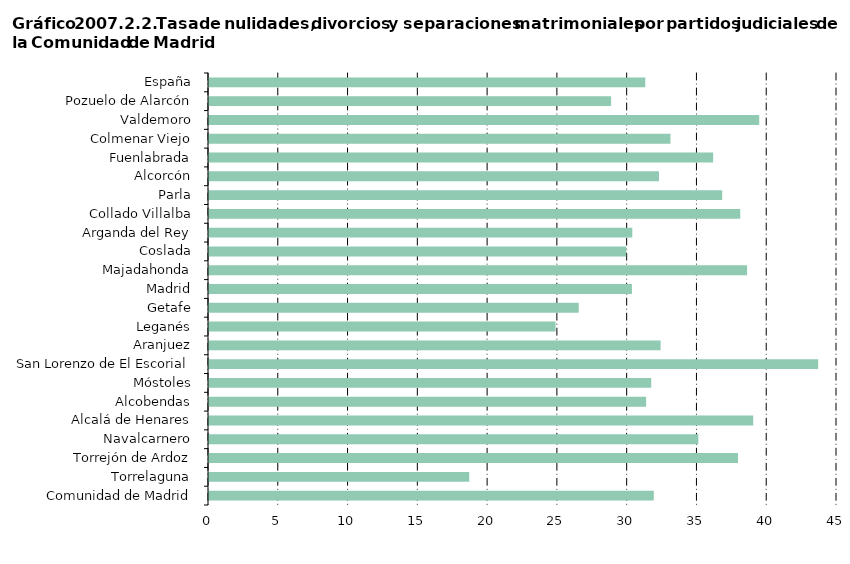
| Category | Series 0 |
|---|---|
| Comunidad de Madrid | 31.871 |
|     Torrelaguna | 18.646 |
|     Torrejón de Ardoz | 37.908 |
|     Navalcarnero | 35.066 |
|     Alcalá de Henares | 39 |
|     Alcobendas | 31.323 |
|     Móstoles | 31.689 |
|     San Lorenzo de El Escorial | 43.652 |
|     Aranjuez | 32.361 |
|     Leganés | 24.831 |
|     Getafe | 26.491 |
|     Madrid | 30.305 |
|     Majadahonda | 38.558 |
|     Coslada | 29.896 |
|     Arganda del Rey | 30.333 |
|     Collado Villalba | 38.068 |
|     Parla | 36.773 |
|     Alcorcón | 32.242 |
|     Fuenlabrada | 36.128 |
|     Colmenar Viejo | 33.066 |
|     Valdemoro | 39.426 |
|     Pozuelo de Alarcón | 28.813 |
| España | 31.261 |